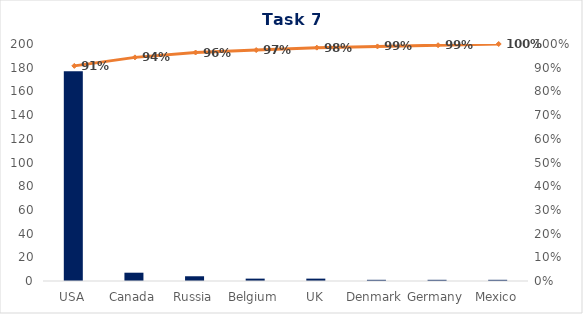
| Category | Series 0 |
|---|---|
| USA | 177 |
| Canada | 7 |
| Russia | 4 |
| Belgium | 2 |
| UK | 2 |
| Denmark | 1 |
| Germany | 1 |
| Mexico | 1 |